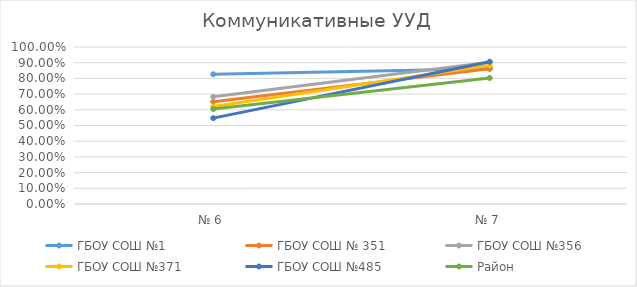
| Category | ГБОУ СОШ №1 | ГБОУ СОШ № 351 | ГБОУ СОШ №356 | ГБОУ СОШ №371 | ГБОУ СОШ №485 | Район |
|---|---|---|---|---|---|---|
| № 6 | 0.826 | 0.651 | 0.683 | 0.621 | 0.547 | 0.605 |
| № 7 | 0.861 | 0.862 | 0.902 | 0.883 | 0.906 | 0.803 |